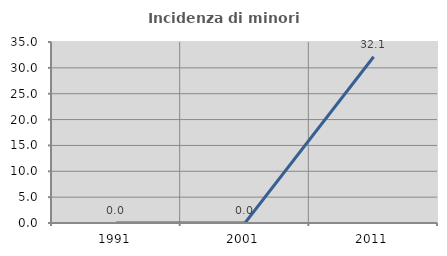
| Category | Incidenza di minori stranieri |
|---|---|
| 1991.0 | 0 |
| 2001.0 | 0 |
| 2011.0 | 32.143 |